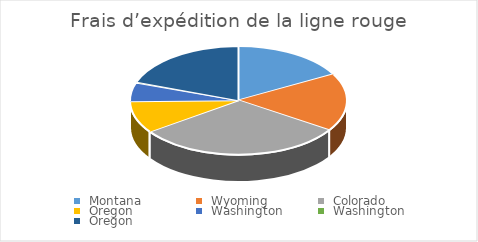
| Category | Frais d’expédition de la ligne rouge |
|---|---|
|  Montana  | 1575 |
|  Wyoming  | 1600 |
|  Colorado  | 2869.56 |
|  Oregon  | 882.69 |
|  Washington  | 512.48 |
|  Washington  | 25 |
|  Oregon | 1800 |